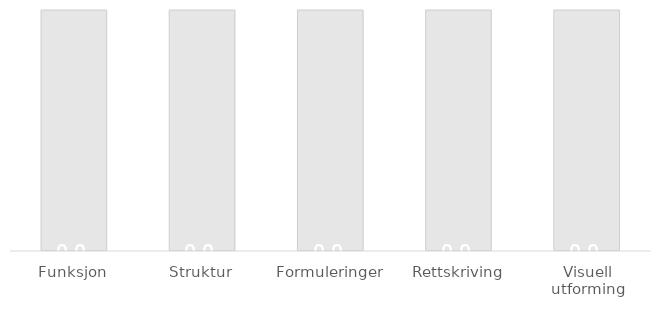
| Category | Series 0 | Series 1 |
|---|---|---|
| Funksjon | 0 | 6 |
| Struktur | 0 | 6 |
| Formuleringer | 0 | 6 |
| Rettskriving | 0 | 6 |
| Visuell utforming | 0 | 6 |